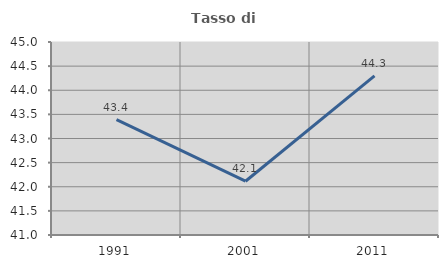
| Category | Tasso di occupazione   |
|---|---|
| 1991.0 | 43.39 |
| 2001.0 | 42.115 |
| 2011.0 | 44.299 |